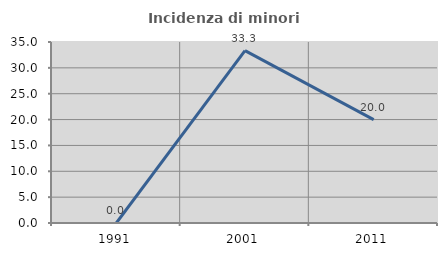
| Category | Incidenza di minori stranieri |
|---|---|
| 1991.0 | 0 |
| 2001.0 | 33.333 |
| 2011.0 | 20 |